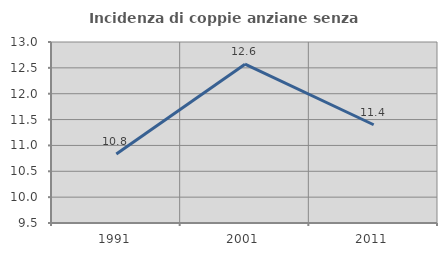
| Category | Incidenza di coppie anziane senza figli  |
|---|---|
| 1991.0 | 10.836 |
| 2001.0 | 12.571 |
| 2011.0 | 11.4 |